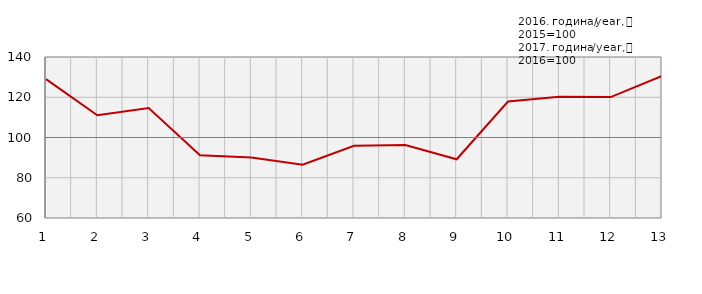
| Category | Индекси ноћења туриста
Tourist night indices |
|---|---|
| 0 | 129.021 |
| 1 | 111.019 |
| 2 | 114.634 |
| 3 | 91.14 |
| 4 | 90.034 |
| 5 | 86.514 |
| 6 | 95.907 |
| 7 | 96.311 |
| 8 | 89.193 |
| 9 | 117.906 |
| 10 | 120.259 |
| 11 | 120.08 |
| 12 | 130.596 |